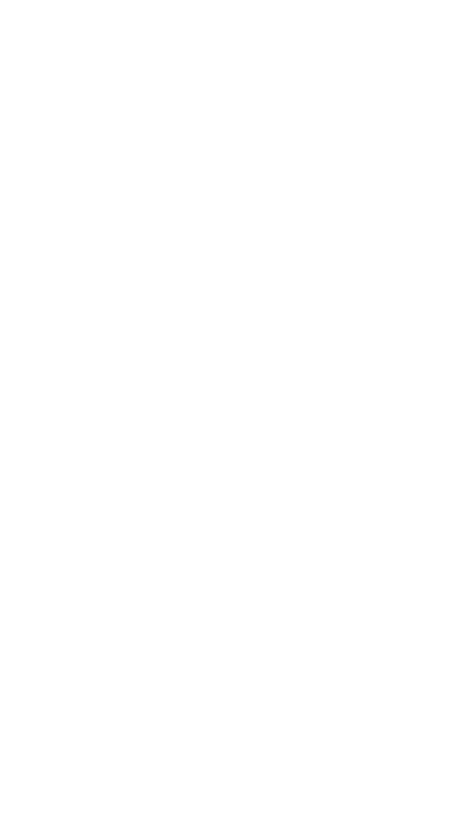
| Category | Series 0 |
|---|---|
| Base Compensation | 0 |
| Incentive Pay | 0 |
| Employee Benefits | 0 |
| Retirement Benefits | 0 |